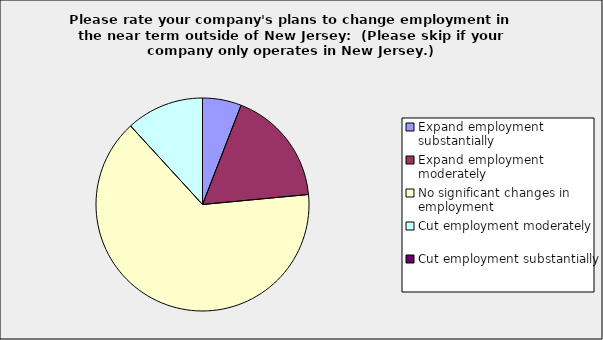
| Category | Series 0 |
|---|---|
| Expand employment substantially | 0.059 |
| Expand employment moderately | 0.176 |
| No significant changes in employment | 0.647 |
| Cut employment moderately | 0.118 |
| Cut employment substantially | 0 |